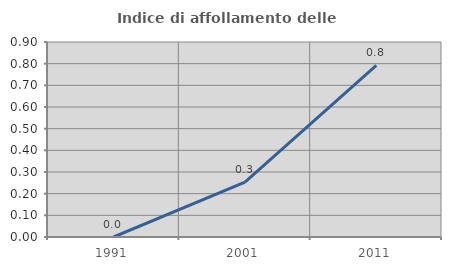
| Category | Indice di affollamento delle abitazioni  |
|---|---|
| 1991.0 | 0 |
| 2001.0 | 0.253 |
| 2011.0 | 0.792 |